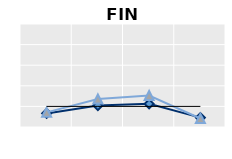
| Category | Public goods | Individual items only | Series 1 |
|---|---|---|---|
| 25-54 | 0.658 | 0.711 | 1 |
| 55-64 | 1.041 | 1.359 | 1 |
| 65+ | 1.123 | 1.524 | 1 |